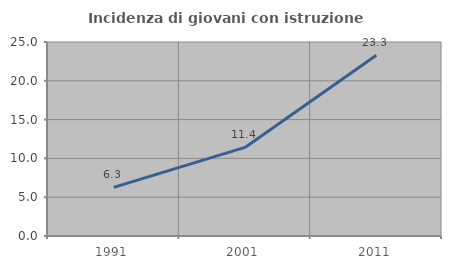
| Category | Incidenza di giovani con istruzione universitaria |
|---|---|
| 1991.0 | 6.263 |
| 2001.0 | 11.415 |
| 2011.0 | 23.282 |